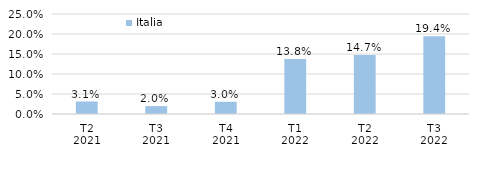
| Category | Italia |
|---|---|
| T2
2021 | 0.031 |
| T3
2021 | 0.02 |
| T4
2021 | 0.03 |
| T1
2022 | 0.138 |
| T2
2022 | 0.147 |
| T3
2022 | 0.194 |